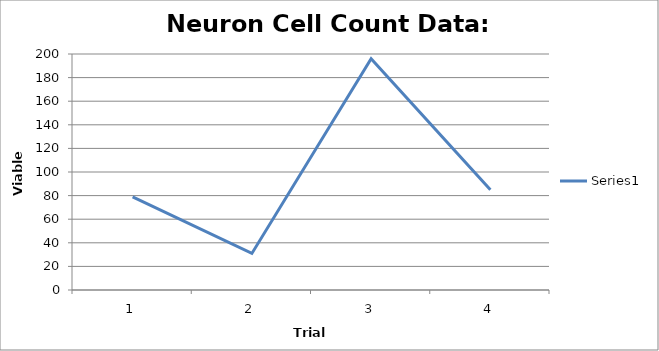
| Category | Series 0 |
|---|---|
| 0 | 79 |
| 1 | 31 |
| 2 | 196 |
| 3 | 85 |